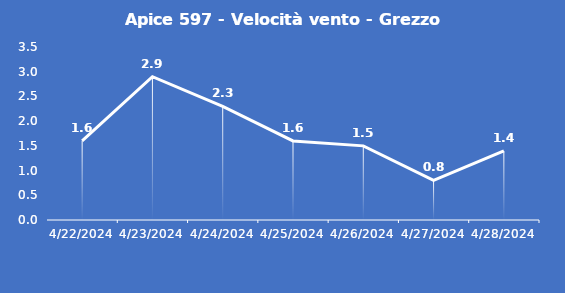
| Category | Apice 597 - Velocità vento - Grezzo (m/s) |
|---|---|
| 4/22/24 | 1.6 |
| 4/23/24 | 2.9 |
| 4/24/24 | 2.3 |
| 4/25/24 | 1.6 |
| 4/26/24 | 1.5 |
| 4/27/24 | 0.8 |
| 4/28/24 | 1.4 |